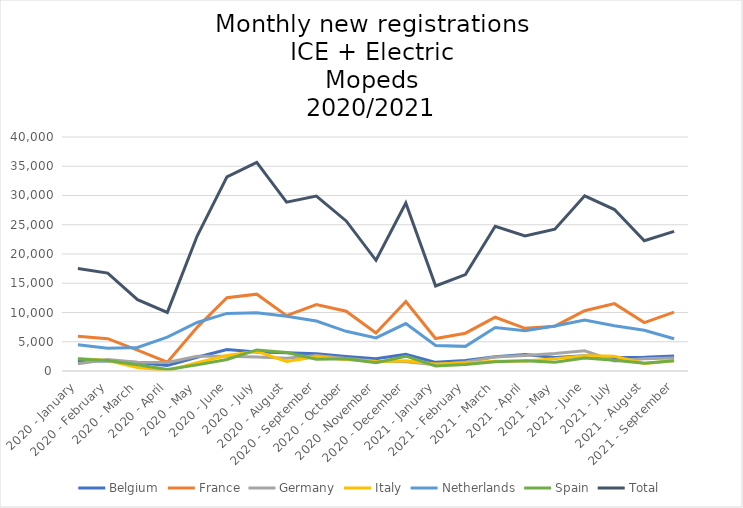
| Category | Belgium | France | Germany | Italy | Netherlands | Spain | Total |
|---|---|---|---|---|---|---|---|
| 2020 - January | 1674 | 5931 | 1233 | 2158 | 4474 | 2034 | 17504 |
| 2020 - February | 1743 | 5522 | 1982 | 1807 | 3898 | 1792 | 16744 |
| 2020 - March | 1462 | 3555 | 1515 | 587 | 4029 | 1053 | 12201 |
| 2020 - April | 953 | 1511 | 1462 | 55 | 5788 | 246 | 10015 |
| 2020 - May | 2347 | 7467 | 2505 | 1408 | 8293 | 1048 | 23068 |
| 2020 - June | 3681 | 12531 | 2517 | 2645 | 9847 | 1960 | 33181 |
| 2020 - July | 3228 | 13133 | 2396 | 3352 | 9959 | 3604 | 35672 |
| 2020 - August | 3104 | 9467 | 2163 | 1617 | 9348 | 3165 | 28864 |
| 2020 - September | 2935 | 11362 | 2657 | 2413 | 8539 | 2004 | 29910 |
| 2020 - October | 2464 | 10219 | 2123 | 1977 | 6786 | 2078 | 25647 |
| 2020 -November | 2095 | 6503 | 1661 | 1590 | 5668 | 1409 | 18926 |
| 2020 - December | 2849 | 11882 | 1591 | 1750 | 8106 | 2530 | 28708 |
| 2021 - January | 1482 | 5551 | 1076 | 1205 | 4370 | 854 | 14538 |
| 2021 - February | 1811 | 6462 | 1526 | 1368 | 4210 | 1104 | 16481 |
| 2021 - March | 2432 | 9190 | 2393 | 1674 | 7441 | 1599 | 24729 |
| 2021 - April | 2802 | 7298 | 2641 | 1700 | 6887 | 1752 | 23080 |
| 2021 - May | 2309 | 7658 | 2979 | 2083 | 7704 | 1505 | 24238 |
| 2021 - June | 2608 | 10307 | 3449 | 2627 | 8725 | 2237 | 29953 |
| 2021 - July | 2314 | 11511 | 1711 | 2508 | 7732 | 1823 | 27599 |
| 2021 - August | 2367 | 8273 | 2086 | 1274 | 6962 | 1312 | 22274 |
| 2021 - September | 2564 | 10063 | 2239 | 1739 | 5506 | 1748 | 23859 |